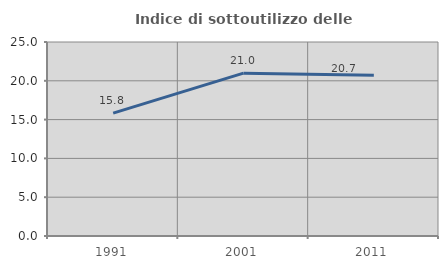
| Category | Indice di sottoutilizzo delle abitazioni  |
|---|---|
| 1991.0 | 15.827 |
| 2001.0 | 20.987 |
| 2011.0 | 20.713 |